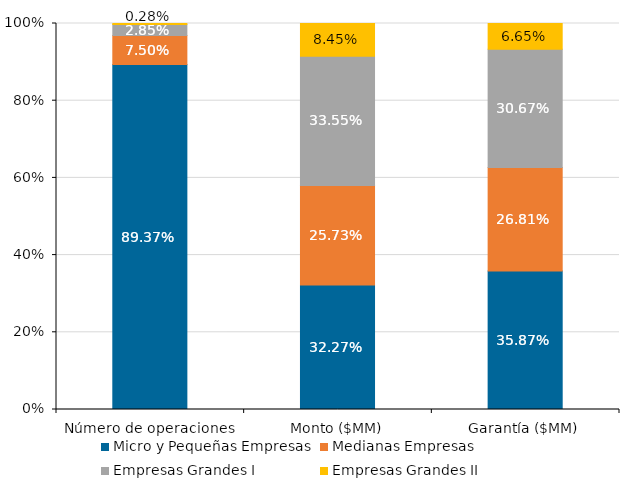
| Category | Micro y Pequeñas Empresas | Medianas Empresas | Empresas Grandes I | Empresas Grandes II |
|---|---|---|---|---|
| Número de operaciones | 0.894 | 0.075 | 0.029 | 0.003 |
| Monto ($MM) | 0.323 | 0.257 | 0.335 | 0.085 |
| Garantía ($MM) | 0.359 | 0.268 | 0.307 | 0.066 |